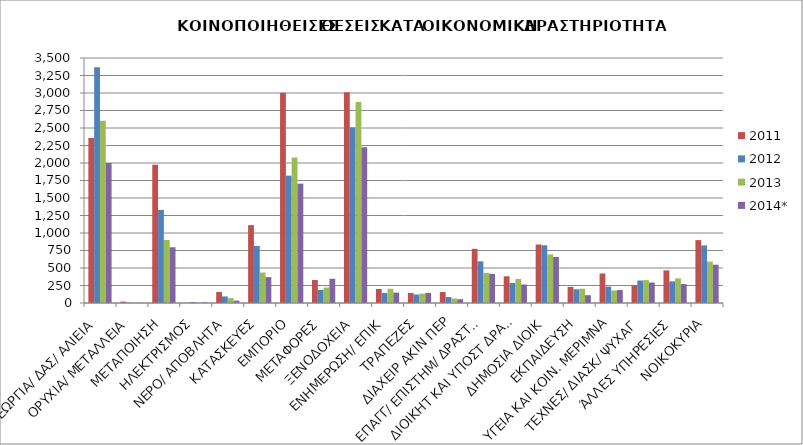
| Category | 2011 | 2012 | 2013 | 2014* |
|---|---|---|---|---|
| ΓΕΩΡΓΙΑ/ ΔΑΣ/ ΑΛΙΕΙΑ | 2358 | 3368 | 2605 | 1999 |
| ΟΡΥΧΙΑ/ ΜΕΤΑΛΛΕΙΑ | 20 | 7 | 2 | 4 |
| ΜΕΤΑΠΟΙΗΣΗ | 1976 | 1330 | 901 | 796 |
| ΗΛΕΚΤΡΙΣΜΟΣ | 3 | 13 | 5 | 10 |
| ΝΕΡΟ/ ΑΠΟΒΛΗΤΑ | 157 | 94 | 69 | 34 |
| ΚΑΤΑΣΚΕΥΕΣ | 1112 | 815 | 436 | 370 |
| ΕΜΠΟΡΙΟ | 3005 | 1819 | 2077 | 1705 |
| ΜΕΤΑΦΟΡΕΣ | 328 | 187 | 221 | 346 |
| ΞΕΝΟΔΟΧΕΙΑ | 3010 | 2507 | 2873 | 2225 |
| ΕΝΗΜΕΡΩΣΗ/ ΕΠΙΚ | 200 | 143 | 203 | 148 |
| ΤΡΑΠΕΖΕΣ | 143 | 121 | 134 | 144 |
| ΔΙΑΧΕΙΡ ΑΚΙΝ ΠΕΡ | 157 | 85 | 64 | 54 |
| ΕΠΑΓΓ/ ΕΠΙΣΤΗΜ/ ΔΡΑΣΤΗΡ | 774 | 595 | 430 | 416 |
| ΔΙΟΙΚΗΤ ΚΑΙ ΥΠΟΣΤ ΔΡΑΣΤΗΡ  | 382 | 285 | 343 | 264 |
| ΔΗΜΟΣΙΑ ΔΙΟΙΚ | 836 | 825 | 694 | 658 |
| ΕΚΠΑΙΔΕΥΣΗ | 230 | 195 | 204 | 112 |
| ΥΓΕΙΑ ΚΑΙ ΚΟΙΝ. ΜΕΡΙΜΝΑ | 422 | 235 | 178 | 185 |
| ΤΕΧΝΕΣ/ ΔΙΑΣΚ/ ΨΥΧΑΓ | 253 | 321 | 327 | 293 |
| ΆΛΛΕΣ ΥΠΗΡΕΣΙΕΣ | 466 | 308 | 352 | 271 |
| ΝΟΙΚΟΚΥΡΙΑ | 898 | 823 | 592 | 547 |